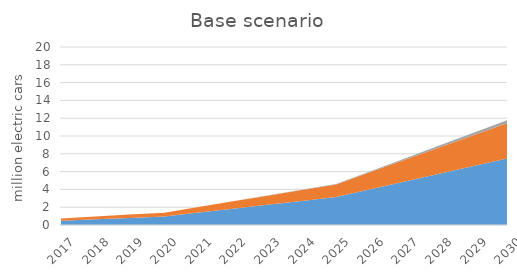
| Category | PHEV | BEV | FCEV |
|---|---|---|---|
| 2017.0 | 481870.532 | 257050.092 | 1091.96 |
| 2018.0 | 640960.362 | 314232.13 | 1463.983 |
| 2019.0 | 800050.192 | 371414.169 | 1836.006 |
| 2020.0 | 959140.022 | 428596.208 | 2208.029 |
| 2021.0 | 1394963.313 | 627912.825 | 10275.677 |
| 2022.0 | 1830786.603 | 827229.442 | 18343.325 |
| 2023.0 | 2266609.894 | 1026546.06 | 26410.973 |
| 2024.0 | 2702433.184 | 1225862.677 | 34478.621 |
| 2025.0 | 3138256.475 | 1425179.294 | 42546.269 |
| 2026.0 | 4009034.047 | 1937086.8 | 99319.37 |
| 2027.0 | 4879811.619 | 2448994.305 | 156092.471 |
| 2028.0 | 5750589.191 | 2960901.81 | 212865.573 |
| 2029.0 | 6621366.764 | 3472809.316 | 269638.674 |
| 2030.0 | 7492144.336 | 3984716.821 | 326411.775 |